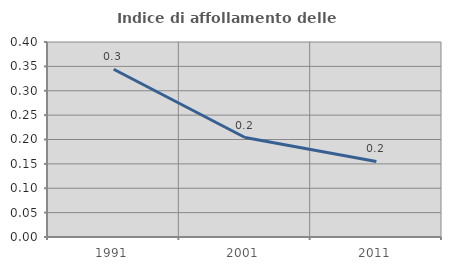
| Category | Indice di affollamento delle abitazioni  |
|---|---|
| 1991.0 | 0.344 |
| 2001.0 | 0.204 |
| 2011.0 | 0.155 |